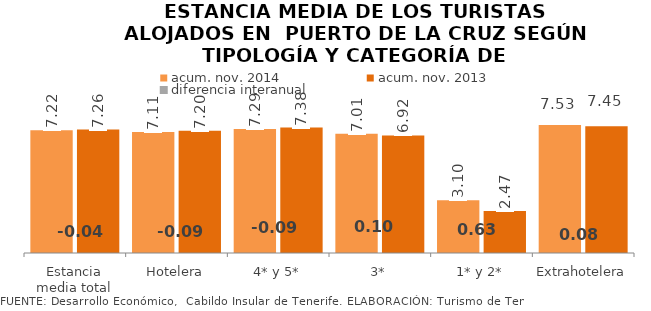
| Category | acum. nov. 2014 | acum. nov. 2013 |
|---|---|---|
| Estancia media total | 7.224 | 7.264 |
| Hotelera | 7.111 | 7.197 |
| 4* y 5* | 7.292 | 7.379 |
| 3* | 7.014 | 6.916 |
| 1* y 2* | 3.101 | 2.468 |
| Extrahotelera | 7.528 | 7.45 |